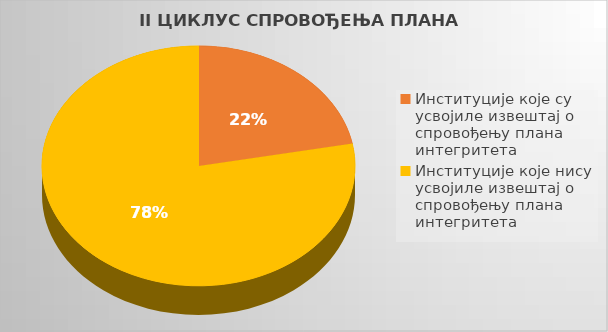
| Category | Series 0 |
|---|---|
| Институције које су усвојиле извештај о спровођењу плана интегритета | 0.22 |
| Институције које нису усвојиле извештај о спровођењу плана интегритета | 0.78 |